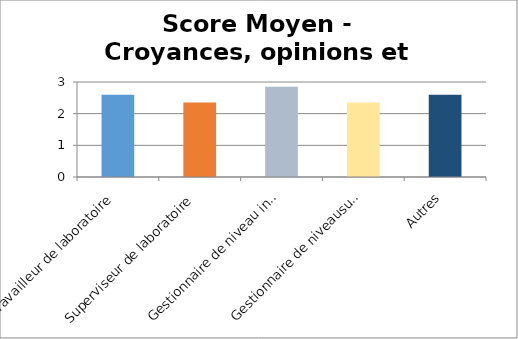
| Category | Score Moyen pour Croyances, opinions et attitudes |
|---|---|
| Travailleur de laboratoire | 2.6 |
| Superviseur de laboratoire | 2.35 |
| Gestionnaire de niveau intermédiaire | 2.85 |
| Gestionnaire de niveausupérieur | 2.35 |
| Autres | 2.6 |